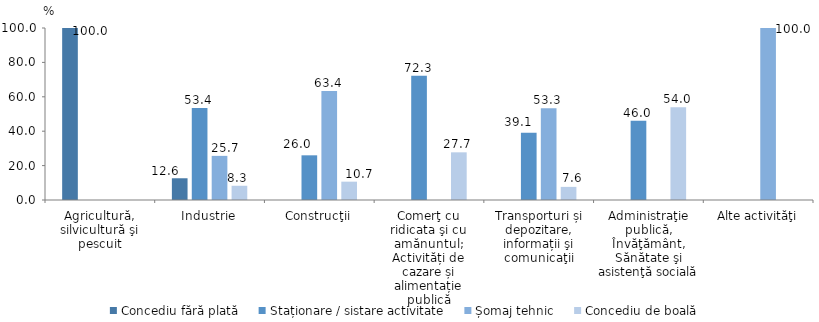
| Category | Concediu fără plată | Staționare / sistare activitate | Șomaj tehnic | Concediu de boală |
|---|---|---|---|---|
| Agricultură, silvicultură şi pescuit | 100 | 0 | 0 | 0 |
| Industrie | 12.638 | 53.435 | 25.657 | 8.27 |
| Construcţii | 0 | 25.978 | 63.364 | 10.658 |
| Comerţ cu ridicata şi cu amănuntul; Activități de cazare și alimentație publică | 0 | 72.285 | 0 | 27.715 |
| Transporturi și depozitare, informații şi comunicaţii | 0 | 39.077 | 53.296 | 7.627 |
| Administraţie publică, Învăţământ, Sănătate şi asistenţă socială | 0 | 46.03 | 0 | 53.97 |
| Alte activităţi | 0 | 0 | 100 | 0 |